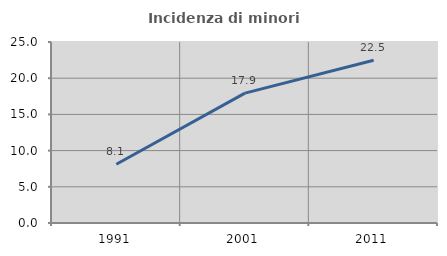
| Category | Incidenza di minori stranieri |
|---|---|
| 1991.0 | 8.108 |
| 2001.0 | 17.941 |
| 2011.0 | 22.485 |